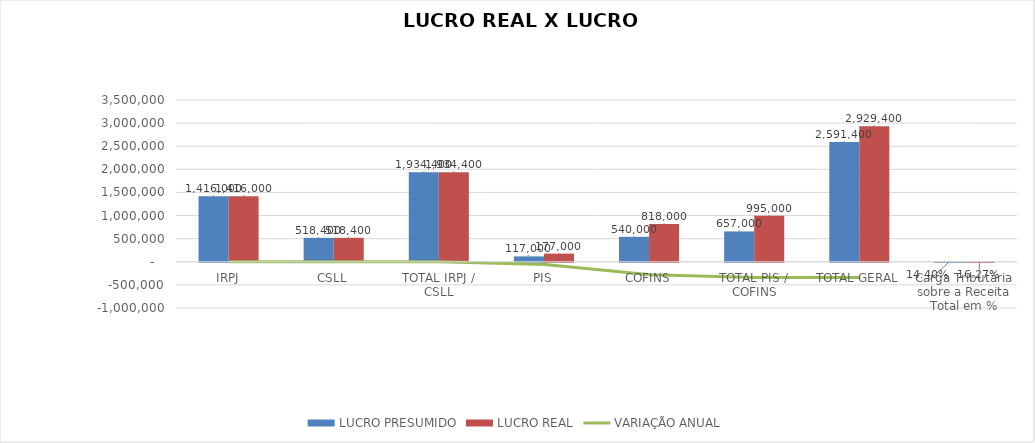
| Category |  LUCRO PRESUMIDO  |  LUCRO REAL  |
|---|---|---|
| IRPJ | 1416000 | 1416000 |
| CSLL | 518400 | 518400 |
| TOTAL IRPJ / CSLL | 1934400 | 1934400 |
| PIS | 117000 | 177000 |
| COFINS | 540000 | 818000 |
| TOTAL PIS / COFINS | 657000 | 995000 |
| TOTAL GERAL | 2591400 | 2929400 |
| Carga Tributária sobre a Receita Total em % | 0.144 | 0.163 |